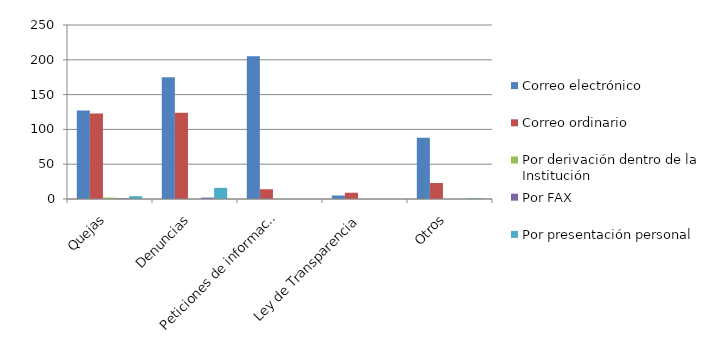
| Category | Correo electrónico  | Correo ordinario | Por derivación dentro de la Institución | Por FAX | Por presentación personal |
|---|---|---|---|---|---|
| Quejas | 127 | 123 | 2 | 1 | 4 |
| Denuncias | 175 | 124 | 0 | 2 | 16 |
| Peticiones de información | 205 | 14 | 0 | 0 | 0 |
| Ley de Transparencia | 5 | 9 | 0 | 0 | 0 |
| Otros | 88 | 23 | 0 | 0 | 1 |